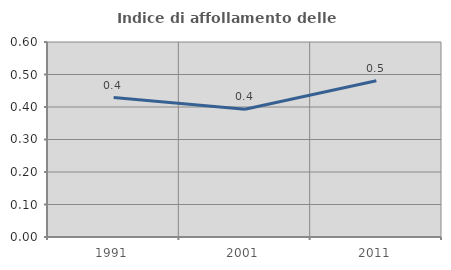
| Category | Indice di affollamento delle abitazioni  |
|---|---|
| 1991.0 | 0.429 |
| 2001.0 | 0.393 |
| 2011.0 | 0.481 |